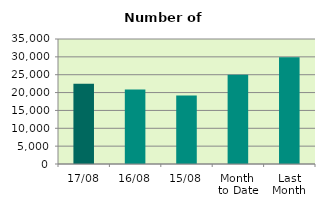
| Category | Series 0 |
|---|---|
| 17/08 | 22446 |
| 16/08 | 20826 |
| 15/08 | 19198 |
| Month 
to Date | 24977.077 |
| Last
Month | 29864.476 |